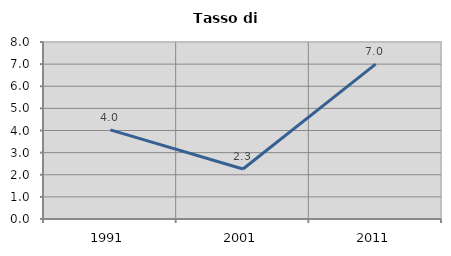
| Category | Tasso di disoccupazione   |
|---|---|
| 1991.0 | 4.027 |
| 2001.0 | 2.258 |
| 2011.0 | 6.997 |